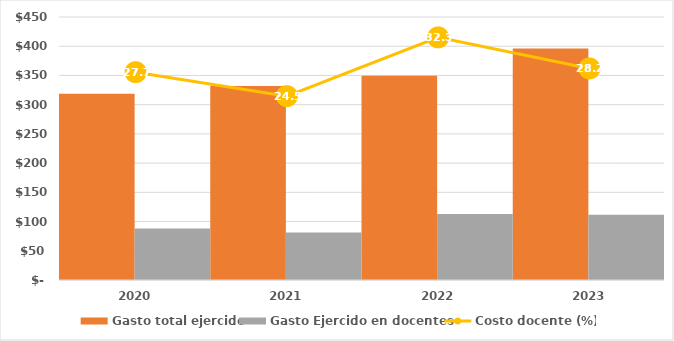
| Category | Gasto total ejercido | Gasto Ejercido en docentes |
|---|---|---|
| 2020.0 | 318785.247 | 88166.964 |
| 2021.0 | 331789.211 | 81169.717 |
| 2022.0 | 349320.095 | 112780.061 |
| 2023.0 | 396127.993 | 111514.438 |